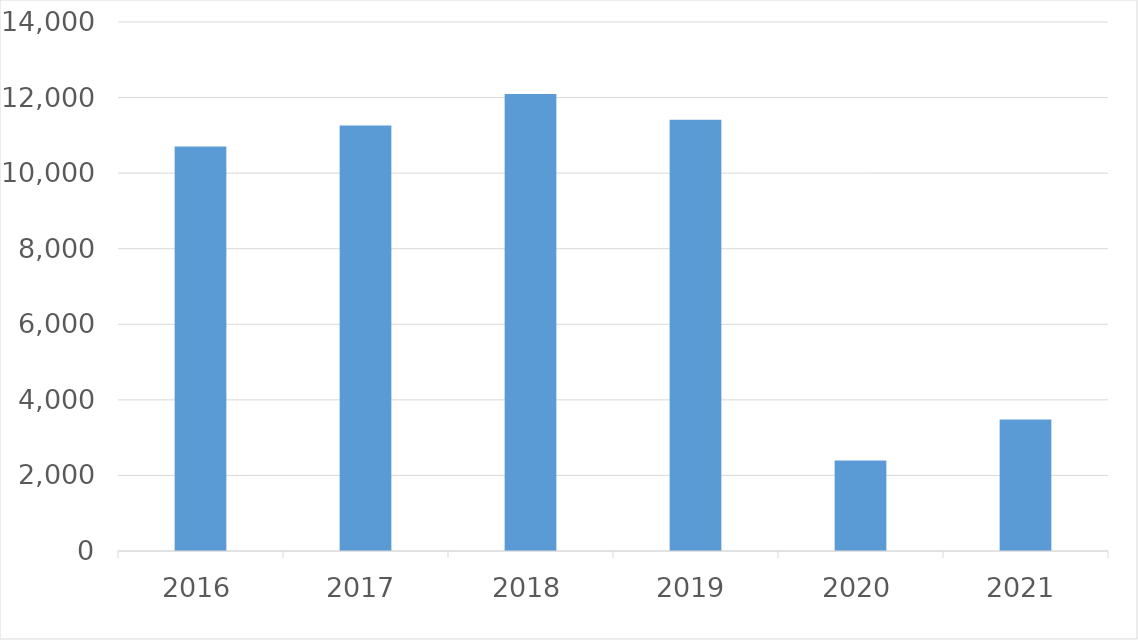
| Category | Series 0 |
|---|---|
| 2016 | 10705 |
| 2017 | 11262 |
| 2018 | 12093 |
| 2019 | 11414 |
| 2020 | 2398 |
| 2021 | 3483 |